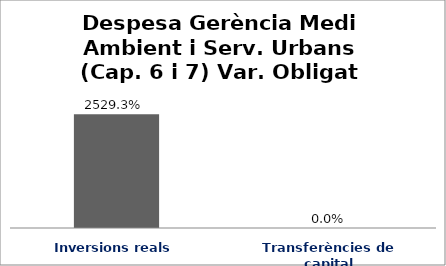
| Category | Series 0 |
|---|---|
| Inversions reals | 25.293 |
| Transferències de capital | 0 |